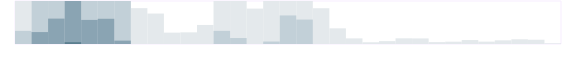
| Category | Производство | Series 1 | Series 2 | Series 3 |
|---|---|---|---|---|
| 0.333333333333333 | 750 | 229 | 0 | 0 |
| nan | 750 | 750 | 208 | 0 |
| nan | 750 | 750 | 443 | 0 |
| nan | 750 | 750 | 750 | 32 |
| 0.416666666666667 | 750 | 750 | 420 | 0 |
| nan | 750 | 750 | 440 | 0 |
| nan | 750 | 750 | 59 | 0 |
| nan | 625 | 0 | 0 | 0 |
| 0.5 | 531 | 0 | 0 | 0 |
| nan | 198 | 0 | 0 | 0 |
| nan | 203 | 0 | 0 | 0 |
| nan | 332 | 0 | 0 | 0 |
| 0.583333333333333 | 750 | 229 | 0 | 0 |
| nan | 750 | 104 | 0 | 0 |
| nan | 617 | 0 | 0 | 0 |
| nan | 750 | 43 | 0 | 0 |
| 0.666666666666667 | 750 | 498 | 0 | 0 |
| nan | 750 | 426 | 0 | 0 |
| nan | 624 | 0 | 0 | 0 |
| nan | 273 | 0 | 0 | 0 |
| 0.75 | 98 | 0 | 0 | 0 |
| nan | 30 | 0 | 0 | 0 |
| nan | 50 | 0 | 0 | 0 |
| nan | 99 | 0 | 0 | 0 |
| 0.833333333333333 | 97 | 0 | 0 | 0 |
| nan | 33 | 0 | 0 | 0 |
| nan | 40 | 0 | 0 | 0 |
| nan | 69 | 0 | 0 | 0 |
| 0.916666666666667 | 41 | 0 | 0 | 0 |
| nan | 64 | 0 | 0 | 0 |
| nan | 82 | 0 | 0 | 0 |
| nan | 74 | 0 | 0 | 0 |
| 0.9993055555555556 | 12 | 0 | 0 | 0 |